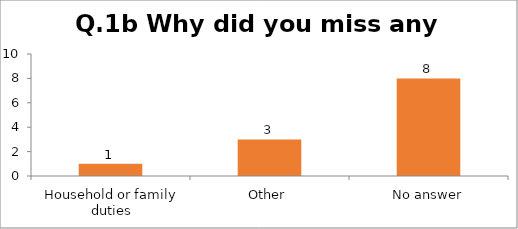
| Category | Q.1b Why did You Missed any Sessions? Please Tick All That Apply |
|---|---|
| Household or family duties | 1 |
| Other | 3 |
| No answer | 8 |